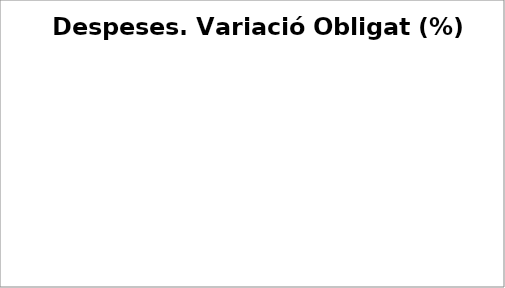
| Category | Series 0 |
|---|---|
| Despeses de personal | 0.031 |
| Despeses en béns corrents i serveis | 0.021 |
| Despeses financeres | -0.68 |
| Transferències corrents | 0.112 |
| Fons de contingència | 0 |
| Inversions reals | -0.277 |
| Transferències de capital | 5.951 |
| Actius financers | 0.099 |
| Passius financers | 0.005 |